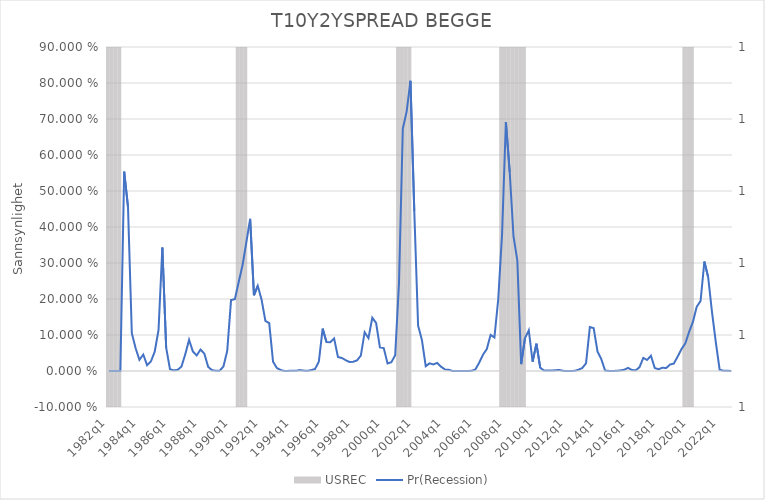
| Category | USREC |
|---|---|
| 1982q1 | 1 |
| 1982q2 | 1 |
| 1982q3 | 1 |
| 1982q4 | 1 |
| 1983q1 | -1 |
| 1983q2 | -1 |
| 1983q3 | -1 |
| 1983q4 | -1 |
| 1984q1 | -1 |
| 1984q2 | -1 |
| 1984q3 | -1 |
| 1984q4 | -1 |
| 1985q1 | -1 |
| 1985q2 | -1 |
| 1985q3 | -1 |
| 1985q4 | -1 |
| 1986q1 | -1 |
| 1986q2 | -1 |
| 1986q3 | -1 |
| 1986q4 | -1 |
| 1987q1 | -1 |
| 1987q2 | -1 |
| 1987q3 | -1 |
| 1987q4 | -1 |
| 1988q1 | -1 |
| 1988q2 | -1 |
| 1988q3 | -1 |
| 1988q4 | -1 |
| 1989q1 | -1 |
| 1989q2 | -1 |
| 1989q3 | -1 |
| 1989q4 | -1 |
| 1990q1 | -1 |
| 1990q2 | -1 |
| 1990q3 | 1 |
| 1990q4 | 1 |
| 1991q1 | 1 |
| 1991q2 | -1 |
| 1991q3 | -1 |
| 1991q4 | -1 |
| 1992q1 | -1 |
| 1992q2 | -1 |
| 1992q3 | -1 |
| 1992q4 | -1 |
| 1993q1 | -1 |
| 1993q2 | -1 |
| 1993q3 | -1 |
| 1993q4 | -1 |
| 1994q1 | -1 |
| 1994q2 | -1 |
| 1994q3 | -1 |
| 1994q4 | -1 |
| 1995q1 | -1 |
| 1995q2 | -1 |
| 1995q3 | -1 |
| 1995q4 | -1 |
| 1996q1 | -1 |
| 1996q2 | -1 |
| 1996q3 | -1 |
| 1996q4 | -1 |
| 1997q1 | -1 |
| 1997q2 | -1 |
| 1997q3 | -1 |
| 1997q4 | -1 |
| 1998q1 | -1 |
| 1998q2 | -1 |
| 1998q3 | -1 |
| 1998q4 | -1 |
| 1999q1 | -1 |
| 1999q2 | -1 |
| 1999q3 | -1 |
| 1999q4 | -1 |
| 2000q1 | -1 |
| 2000q2 | -1 |
| 2000q3 | -1 |
| 2000q4 | -1 |
| 2001q1 | 1 |
| 2001q2 | 1 |
| 2001q3 | 1 |
| 2001q4 | 1 |
| 2002q1 | -1 |
| 2002q2 | -1 |
| 2002q3 | -1 |
| 2002q4 | -1 |
| 2003q1 | -1 |
| 2003q2 | -1 |
| 2003q3 | -1 |
| 2003q4 | -1 |
| 2004q1 | -1 |
| 2004q2 | -1 |
| 2004q3 | -1 |
| 2004q4 | -1 |
| 2005q1 | -1 |
| 2005q2 | -1 |
| 2005q3 | -1 |
| 2005q4 | -1 |
| 2006q1 | -1 |
| 2006q2 | -1 |
| 2006q3 | -1 |
| 2006q4 | -1 |
| 2007q1 | -1 |
| 2007q2 | -1 |
| 2007q3 | -1 |
| 2007q4 | 1 |
| 2008q1 | 1 |
| 2008q2 | 1 |
| 2008q3 | 1 |
| 2008q4 | 1 |
| 2009q1 | 1 |
| 2009q2 | 1 |
| 2009q3 | -1 |
| 2009q4 | -1 |
| 2010q1 | -1 |
| 2010q2 | -1 |
| 2010q3 | -1 |
| 2010q4 | -1 |
| 2011q1 | -1 |
| 2011q2 | -1 |
| 2011q3 | -1 |
| 2011q4 | -1 |
| 2012q1 | -1 |
| 2012q2 | -1 |
| 2012q3 | -1 |
| 2012q4 | -1 |
| 2013q1 | -1 |
| 2013q2 | -1 |
| 2013q3 | -1 |
| 2013q4 | -1 |
| 2014q1 | -1 |
| 2014q2 | -1 |
| 2014q3 | -1 |
| 2014q4 | -1 |
| 2015q1 | -1 |
| 2015q2 | -1 |
| 2015q3 | -1 |
| 2015q4 | -1 |
| 2016q1 | -1 |
| 2016q2 | -1 |
| 2016q3 | -1 |
| 2016q4 | -1 |
| 2017q1 | -1 |
| 2017q2 | -1 |
| 2017q3 | -1 |
| 2017q4 | -1 |
| 2018q1 | -1 |
| 2018q2 | -1 |
| 2018q3 | -1 |
| 2018q4 | -1 |
| 2019q1 | -1 |
| 2019q2 | -1 |
| 2019q3 | -1 |
| 2019q4 | 1 |
| 2020q1 | 1 |
| 2020q2 | 1 |
| 2020q3 | -1 |
| 2020q4 | -1 |
| 2021q1 | -1 |
| 2021q2 | -1 |
| 2021q3 | -1 |
| 2021q4 | -1 |
| 2022q1 | -1 |
| 2022q2 | -1 |
| 2022q3 | -1 |
| 2022q4 | -1 |